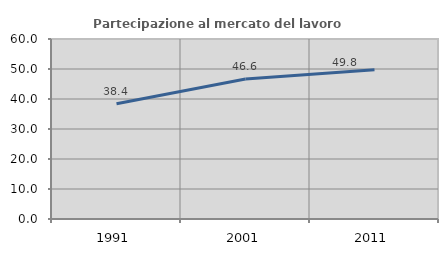
| Category | Partecipazione al mercato del lavoro  femminile |
|---|---|
| 1991.0 | 38.434 |
| 2001.0 | 46.648 |
| 2011.0 | 49.755 |